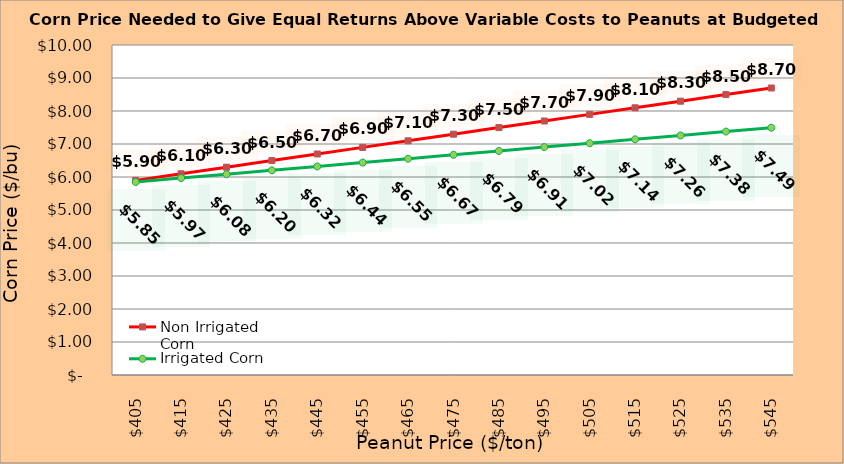
| Category | Non Irrigated Corn | Irrigated Corn |
|---|---|---|
| 405.0 | 5.897 | 5.849 |
| 415.0 | 6.097 | 5.967 |
| 425.0 | 6.297 | 6.084 |
| 435.0 | 6.497 | 6.202 |
| 445.0 | 6.697 | 6.319 |
| 455.0 | 6.897 | 6.437 |
| 465.0 | 7.097 | 6.554 |
| 475.0 | 7.297 | 6.672 |
| 485.0 | 7.497 | 6.789 |
| 495.0 | 7.697 | 6.907 |
| 505.0 | 7.897 | 7.024 |
| 515.0 | 8.097 | 7.142 |
| 525.0 | 8.297 | 7.259 |
| 535.0 | 8.497 | 7.377 |
| 545.0 | 8.697 | 7.494 |